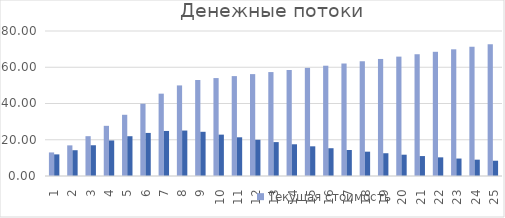
| Category | Текущая стоимость | Дисконтированная стоимость |
|---|---|---|
| 1 | 13 | 11.927 |
| 2 | 16.9 | 14.224 |
| 3 | 21.97 | 16.965 |
| 4 | 27.682 | 19.611 |
| 5 | 33.772 | 21.95 |
| 6 | 39.851 | 23.762 |
| 7 | 45.43 | 24.852 |
| 8 | 49.974 | 25.08 |
| 9 | 52.972 | 24.39 |
| 10 | 54.031 | 22.823 |
| 11 | 55.112 | 21.358 |
| 12 | 56.214 | 19.986 |
| 13 | 57.339 | 18.703 |
| 14 | 58.485 | 17.502 |
| 15 | 59.655 | 16.378 |
| 16 | 60.848 | 15.326 |
| 17 | 62.065 | 14.342 |
| 18 | 63.306 | 13.421 |
| 19 | 64.572 | 12.559 |
| 20 | 65.864 | 11.752 |
| 21 | 67.181 | 10.997 |
| 22 | 68.525 | 10.291 |
| 23 | 69.895 | 9.63 |
| 24 | 71.293 | 9.012 |
| 25 | 72.719 | 8.433 |